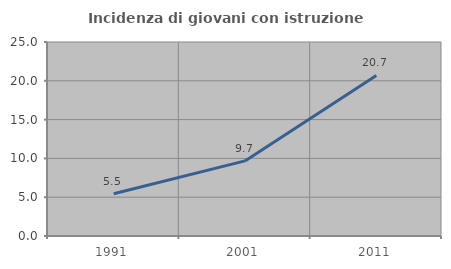
| Category | Incidenza di giovani con istruzione universitaria |
|---|---|
| 1991.0 | 5.455 |
| 2001.0 | 9.677 |
| 2011.0 | 20.69 |